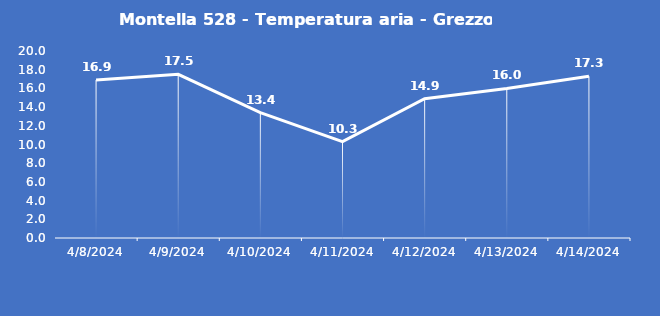
| Category | Montella 528 - Temperatura aria - Grezzo (°C) |
|---|---|
| 4/8/24 | 16.9 |
| 4/9/24 | 17.5 |
| 4/10/24 | 13.4 |
| 4/11/24 | 10.3 |
| 4/12/24 | 14.9 |
| 4/13/24 | 16 |
| 4/14/24 | 17.3 |